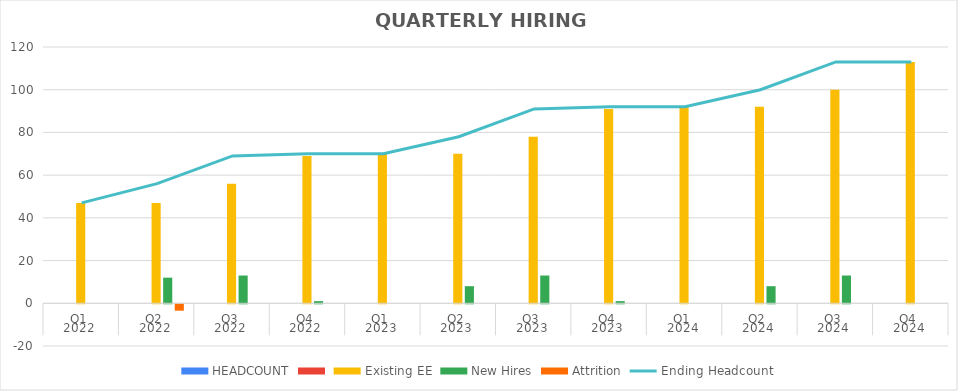
| Category | HEADCOUNT | Series 1 | Existing EE | New Hires | Attrition |
|---|---|---|---|---|---|
| 0 |  |  | 47 | 0 | 0 |
| 1 |  |  | 47 | 12 | -3 |
| 2 |  |  | 56 | 13 | 0 |
| 3 |  |  | 69 | 1 | 0 |
| 4 |  |  | 70 | 0 | 0 |
| 5 |  |  | 70 | 8 | 0 |
| 6 |  |  | 78 | 13 | 0 |
| 7 |  |  | 91 | 1 | 0 |
| 8 |  |  | 92 | 0 | 0 |
| 9 |  |  | 92 | 8 | 0 |
| 10 |  |  | 100 | 13 | 0 |
| 11 |  |  | 113 | 0 | 0 |